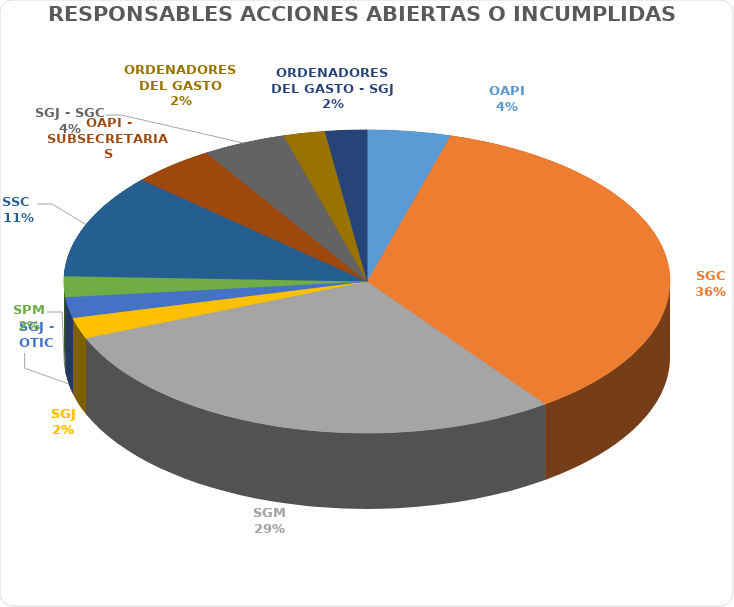
| Category | Series 0 |
|---|---|
| OAPI | 2 |
| SGC | 16 |
| SGM | 13 |
| SGJ | 1 |
| SGJ - OTIC | 1 |
| SPM | 1 |
| SSC  | 5 |
| OAPI - SUBSECRETARIAS | 2 |
| SGJ - SGC | 2 |
| ORDENADORES DEL GASTO | 1 |
| ORDENADORES DEL GASTO - SGJ | 1 |